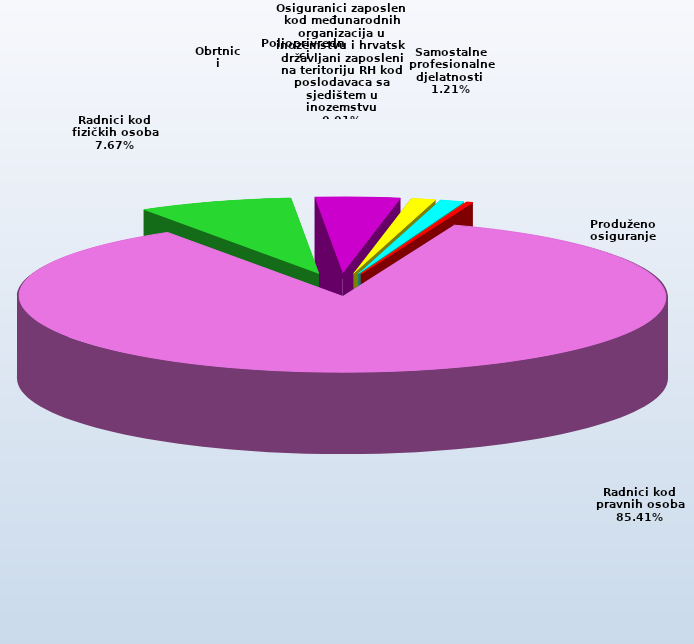
| Category | Series 0 |
|---|---|
| Radnici kod pravnih osoba | 1361072 |
| Radnici kod fizičkih osoba | 122193 |
| Obrtnici | 66933 |
| Poljoprivrednici | 19268 |
| Samostalne profesionalne djelatnosti  | 19314 |
| Osiguranici zaposleni kod međunarodnih organizacija u inozemstvu i hrvatski državljani zaposleni na teritoriju RH kod poslodavaca sa sjedištem u inozemstvu | 88 |
| Produženo osiguranje | 4715 |